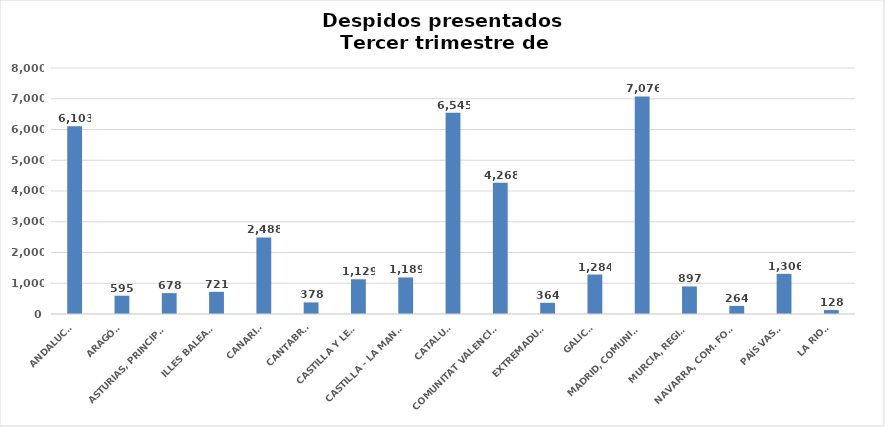
| Category | Series 0 |
|---|---|
| ANDALUCÍA | 6103 |
| ARAGÓN | 595 |
| ASTURIAS, PRINCIPADO | 678 |
| ILLES BALEARS | 721 |
| CANARIAS | 2488 |
| CANTABRIA | 378 |
| CASTILLA Y LEÓN | 1129 |
| CASTILLA - LA MANCHA | 1189 |
| CATALUÑA | 6545 |
| COMUNITAT VALENCIANA | 4268 |
| EXTREMADURA | 364 |
| GALICIA | 1284 |
| MADRID, COMUNIDAD | 7076 |
| MURCIA, REGIÓN | 897 |
| NAVARRA, COM. FORAL | 264 |
| PAÍS VASCO | 1306 |
| LA RIOJA | 128 |